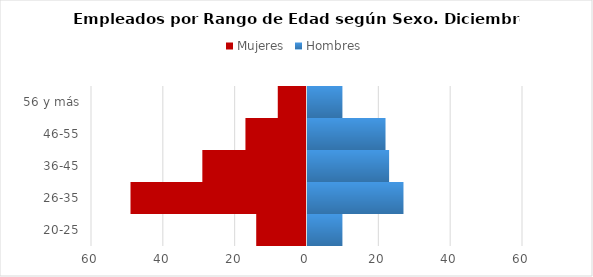
| Category | Mujeres | Hombres |
|---|---|---|
| 20-25 | -14 | 10 |
| 26-35 | -49 | 27 |
| 36-45 | -29 | 23 |
| 46-55 | -17 | 22 |
| 56 y más | -8 | 10 |